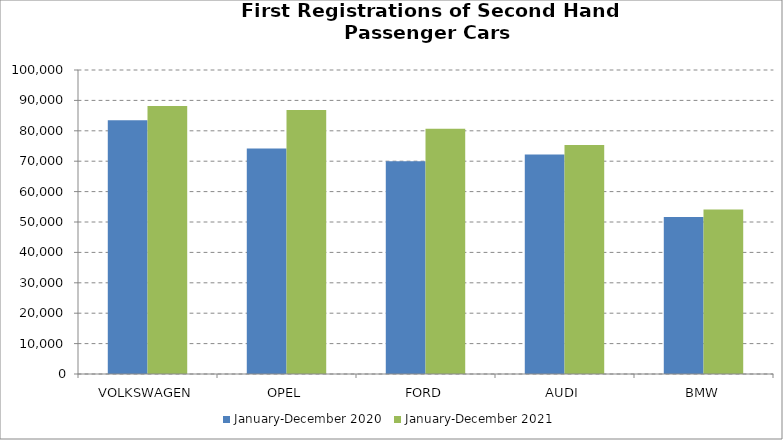
| Category | January-December 2020 | January-December 2021 |
|---|---|---|
| VOLKSWAGEN | 83504 | 88195 |
| OPEL | 74148 | 86839 |
| FORD | 70010 | 80652 |
| AUDI | 72169 | 75336 |
| BMW | 51654 | 54136 |